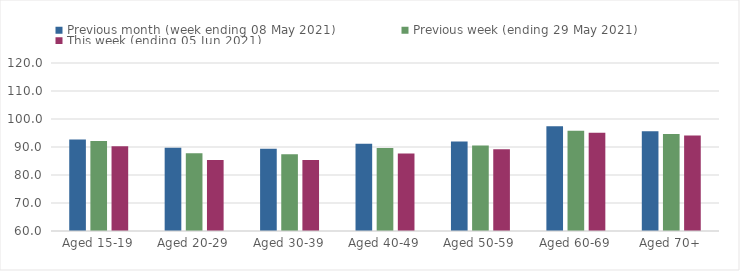
| Category | Previous month (week ending 08 May 2021) | Previous week (ending 29 May 2021) | This week (ending 05 Jun 2021) |
|---|---|---|---|
| Aged 15-19 | 92.72 | 92.11 | 90.27 |
| Aged 20-29 | 89.75 | 87.74 | 85.37 |
| Aged 30-39 | 89.41 | 87.42 | 85.4 |
| Aged 40-49 | 91.18 | 89.66 | 87.68 |
| Aged 50-59 | 91.94 | 90.57 | 89.19 |
| Aged 60-69 | 97.38 | 95.76 | 95.11 |
| Aged 70+ | 95.66 | 94.67 | 94.15 |